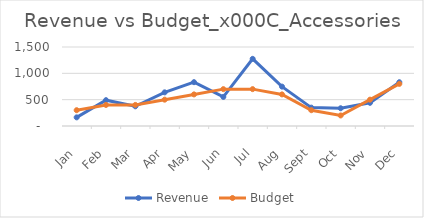
| Category | Revenue | Budget |
|---|---|---|
| 2017-01-31 | 164 | 300 |
| 2017-02-28 | 490 | 400 |
| 2017-03-31 | 374 | 400 |
| 2017-04-30 | 639 | 500 |
| 2017-05-31 | 832 | 600 |
| 2017-06-30 | 552 | 700 |
| 2017-07-31 | 1275 | 700 |
| 2017-08-31 | 748 | 600 |
| 2017-09-30 | 349 | 300 |
| 2017-10-31 | 337 | 200 |
| 2017-11-30 | 440 | 500 |
| 2017-12-31 | 831 | 800 |